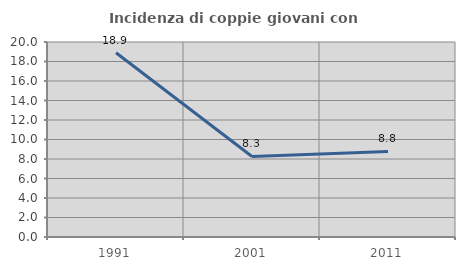
| Category | Incidenza di coppie giovani con figli |
|---|---|
| 1991.0 | 18.898 |
| 2001.0 | 8.257 |
| 2011.0 | 8.772 |